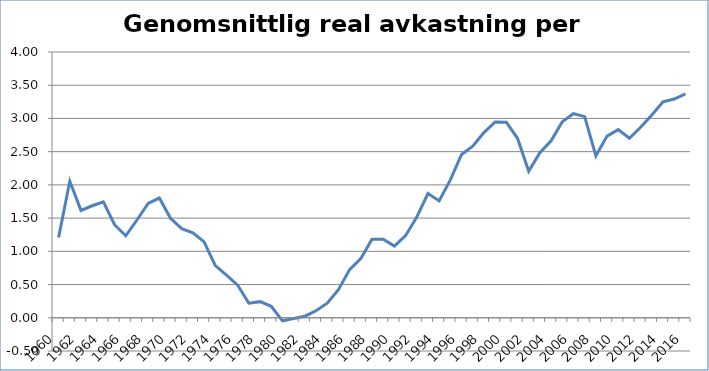
| Category | Genomsnittlig real  |
|---|---|
| 1960.0 | 1.207 |
| 1961.0 | 2.054 |
| 1962.0 | 1.616 |
| 1963.0 | 1.686 |
| 1964.0 | 1.746 |
| 1965.0 | 1.401 |
| 1966.0 | 1.234 |
| 1967.0 | 1.471 |
| 1968.0 | 1.721 |
| 1969.0 | 1.802 |
| 1970.0 | 1.498 |
| 1971.0 | 1.341 |
| 1972.0 | 1.278 |
| 1973.0 | 1.143 |
| 1974.0 | 0.785 |
| 1975.0 | 0.641 |
| 1976.0 | 0.49 |
| 1977.0 | 0.22 |
| 1978.0 | 0.243 |
| 1979.0 | 0.173 |
| 1980.0 | -0.046 |
| 1981.0 | -0.01 |
| 1982.0 | 0.024 |
| 1983.0 | 0.105 |
| 1984.0 | 0.219 |
| 1985.0 | 0.422 |
| 1986.0 | 0.724 |
| 1987.0 | 0.893 |
| 1988.0 | 1.183 |
| 1989.0 | 1.183 |
| 1990.0 | 1.079 |
| 1991.0 | 1.236 |
| 1992.0 | 1.514 |
| 1993.0 | 1.87 |
| 1994.0 | 1.759 |
| 1995.0 | 2.075 |
| 1996.0 | 2.457 |
| 1997.0 | 2.583 |
| 1998.0 | 2.787 |
| 1999.0 | 2.948 |
| 2000.0 | 2.944 |
| 2001.0 | 2.701 |
| 2002.0 | 2.205 |
| 2003.0 | 2.484 |
| 2004.0 | 2.665 |
| 2005.0 | 2.949 |
| 2006.0 | 3.074 |
| 2007.0 | 3.027 |
| 2008.0 | 2.437 |
| 2009.0 | 2.735 |
| 2010.0 | 2.832 |
| 2011.0 | 2.702 |
| 2012.0 | 2.866 |
| 2013.0 | 3.052 |
| 2014.0 | 3.25 |
| 2015.0 | 3.292 |
| 2016.0 | 3.37 |